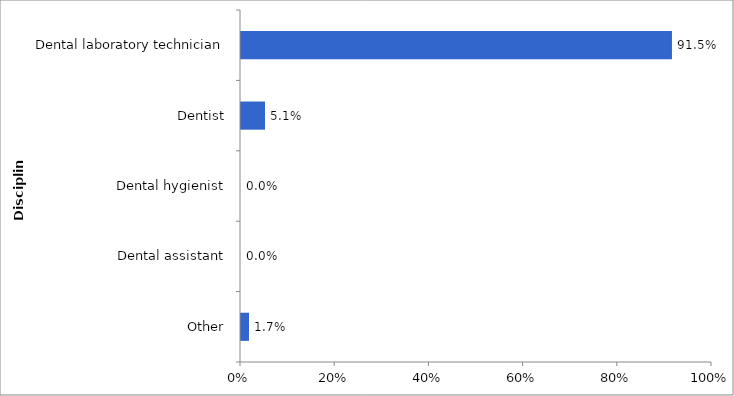
| Category | 2014-15 |
|---|---|
| Other | 0.017 |
| Dental assistant | 0 |
| Dental hygienist | 0 |
| Dentist | 0.051 |
| Dental laboratory technician | 0.915 |